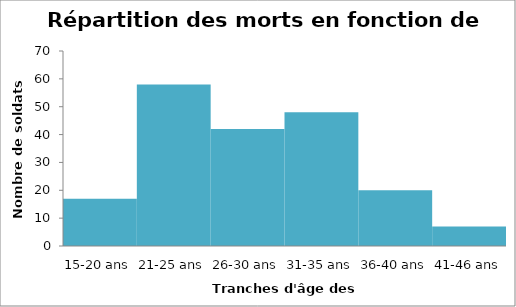
| Category | Series 0 |
|---|---|
| 15-20 ans | 17 |
| 21-25 ans | 58 |
| 26-30 ans | 42 |
| 31-35 ans | 48 |
| 36-40 ans | 20 |
| 41-46 ans | 7 |